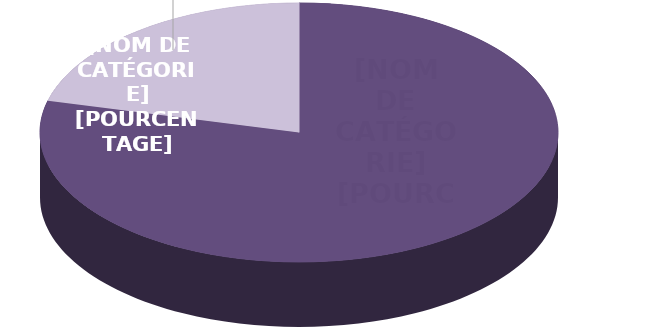
| Category | Series 0 |
|---|---|
| Formation de base | 4100 |
| Formation avancée | 1094 |